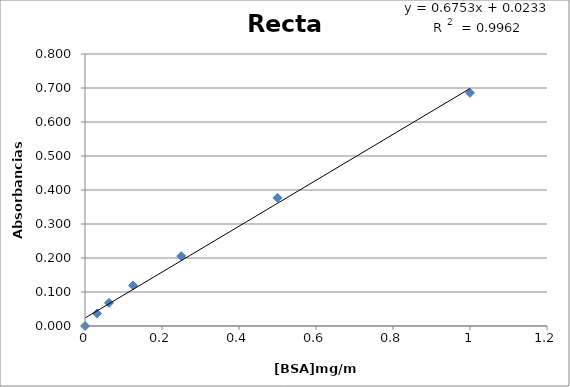
| Category | Series 0 |
|---|---|
| 1.0 | 0.686 |
| 0.5 | 0.377 |
| 0.25 | 0.206 |
| 0.125 | 0.119 |
| 0.0625 | 0.068 |
| 0.03125 | 0.037 |
| 0.0 | 0 |